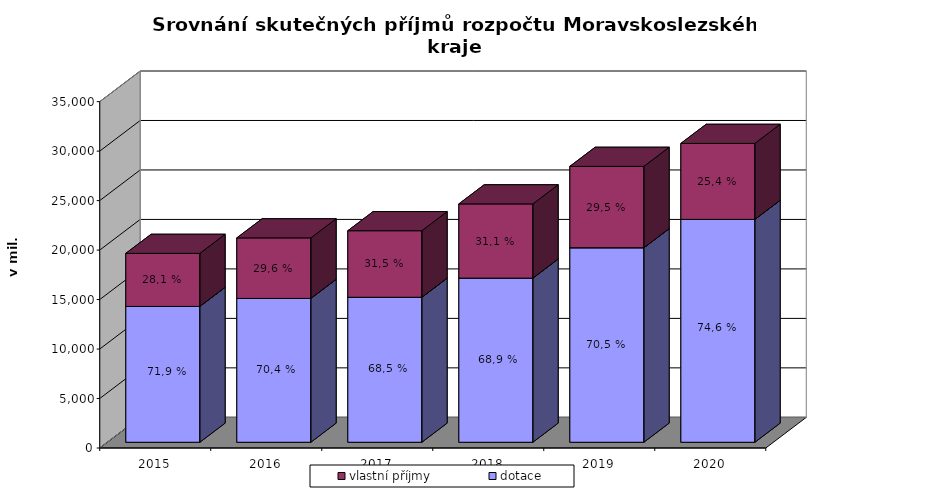
| Category | dotace | vlastní příjmy |
|---|---|---|
| 2015.0 | 13726.48 | 5360.395 |
| 2016.0 | 14534.133 | 6116.069 |
| 2017.0 | 14651.604 | 6723.521 |
| 2018.0 | 16584.967 | 7499.883 |
| 2019.0 | 19656.418 | 8223.054 |
| 2020.0 | 22521.791 | 7678.534 |